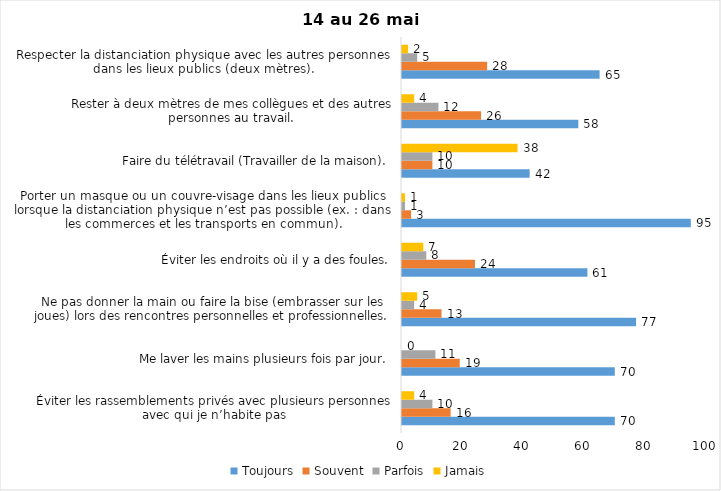
| Category | Toujours | Souvent | Parfois | Jamais |
|---|---|---|---|---|
| Éviter les rassemblements privés avec plusieurs personnes avec qui je n’habite pas | 70 | 16 | 10 | 4 |
| Me laver les mains plusieurs fois par jour. | 70 | 19 | 11 | 0 |
| Ne pas donner la main ou faire la bise (embrasser sur les joues) lors des rencontres personnelles et professionnelles. | 77 | 13 | 4 | 5 |
| Éviter les endroits où il y a des foules. | 61 | 24 | 8 | 7 |
| Porter un masque ou un couvre-visage dans les lieux publics lorsque la distanciation physique n’est pas possible (ex. : dans les commerces et les transports en commun). | 95 | 3 | 1 | 1 |
| Faire du télétravail (Travailler de la maison). | 42 | 10 | 10 | 38 |
| Rester à deux mètres de mes collègues et des autres personnes au travail. | 58 | 26 | 12 | 4 |
| Respecter la distanciation physique avec les autres personnes dans les lieux publics (deux mètres). | 65 | 28 | 5 | 2 |